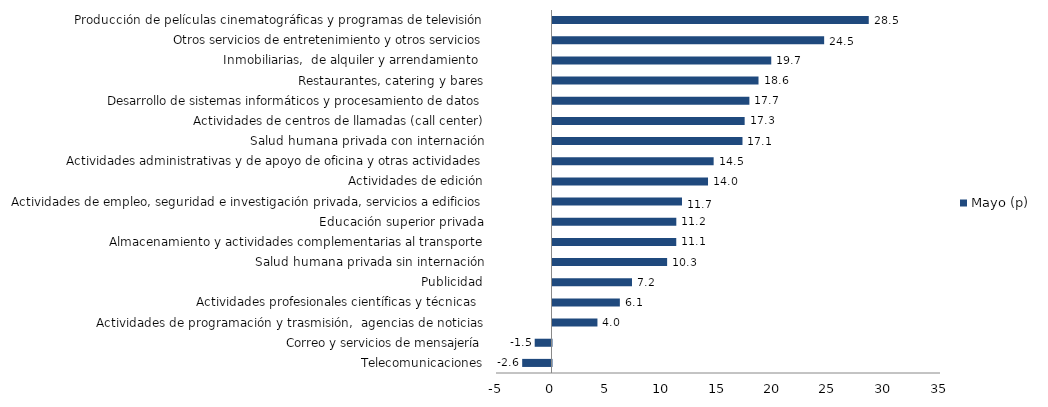
| Category | Mayo (p) |
|---|---|
| Telecomunicaciones | -2.642 |
| Correo y servicios de mensajería | -1.514 |
| Actividades de programación y trasmisión,  agencias de noticias | 4.049 |
| Actividades profesionales científicas y técnicas  | 6.068 |
| Publicidad | 7.162 |
| Salud humana privada sin internación | 10.327 |
| Almacenamiento y actividades complementarias al transporte | 11.15 |
| Educación superior privada | 11.155 |
| Actividades de empleo, seguridad e investigación privada, servicios a edificios | 11.666 |
| Actividades de edición | 14.01 |
| Actividades administrativas y de apoyo de oficina y otras actividades | 14.518 |
| Salud humana privada con internación | 17.116 |
| Actividades de centros de llamadas (call center) | 17.312 |
| Desarrollo de sistemas informáticos y procesamiento de datos | 17.738 |
| Restaurantes, catering y bares | 18.56 |
| Inmobiliarias,  de alquiler y arrendamiento  | 19.707 |
| Otros servicios de entretenimiento y otros servicios | 24.473 |
| Producción de películas cinematográficas y programas de televisión | 28.492 |